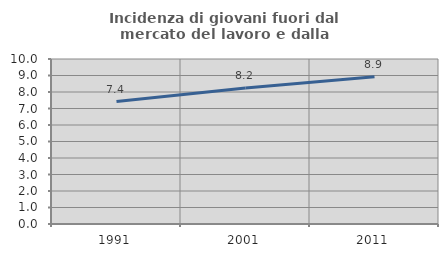
| Category | Incidenza di giovani fuori dal mercato del lavoro e dalla formazione  |
|---|---|
| 1991.0 | 7.424 |
| 2001.0 | 8.247 |
| 2011.0 | 8.917 |